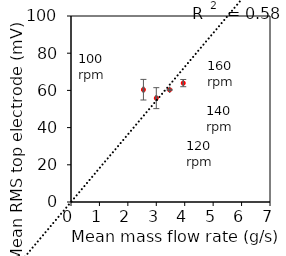
| Category | Series 0 |
|---|---|
| 2.548033333333333 | 60.377 |
| 3.0005666666666664 | 55.837 |
| 3.4709 | 60.326 |
| 3.9486666666666665 | 63.922 |